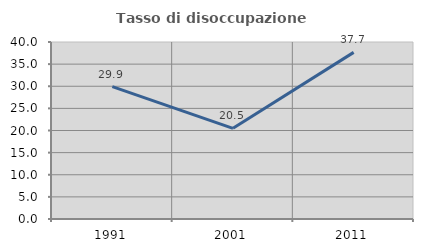
| Category | Tasso di disoccupazione giovanile  |
|---|---|
| 1991.0 | 29.899 |
| 2001.0 | 20.485 |
| 2011.0 | 37.652 |